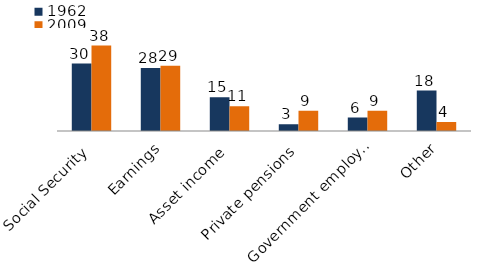
| Category | 1962 | 2009 |
|---|---|---|
| Social Security | 30 | 38 |
| Earnings | 28 | 29 |
| Asset income | 15 | 11 |
| Private pensions | 3 | 9 |
| Government employee pensions | 6 | 9 |
| Other | 18 | 4 |